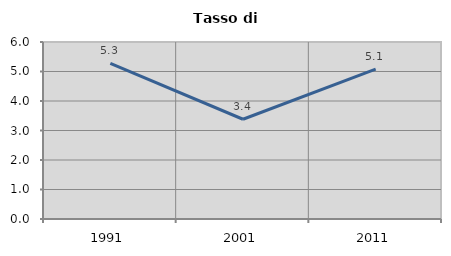
| Category | Tasso di disoccupazione   |
|---|---|
| 1991.0 | 5.274 |
| 2001.0 | 3.381 |
| 2011.0 | 5.084 |